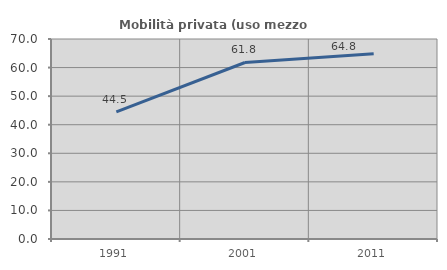
| Category | Mobilità privata (uso mezzo privato) |
|---|---|
| 1991.0 | 44.524 |
| 2001.0 | 61.781 |
| 2011.0 | 64.823 |